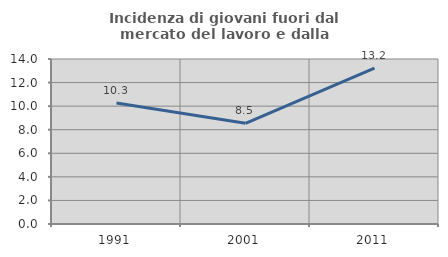
| Category | Incidenza di giovani fuori dal mercato del lavoro e dalla formazione  |
|---|---|
| 1991.0 | 10.268 |
| 2001.0 | 8.547 |
| 2011.0 | 13.235 |